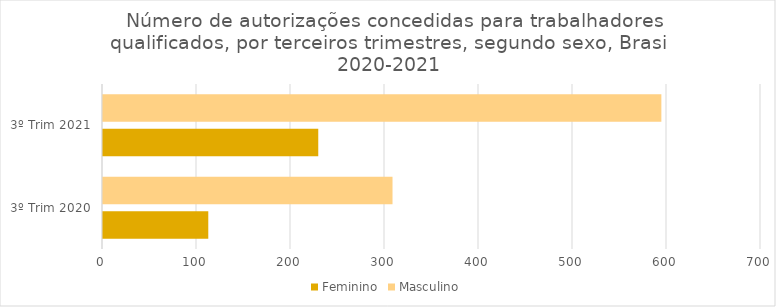
| Category | Feminino | Masculino |
|---|---|---|
| 3º Trim 2020 | 112 | 308 |
| 3º Trim 2021 | 229 | 594 |